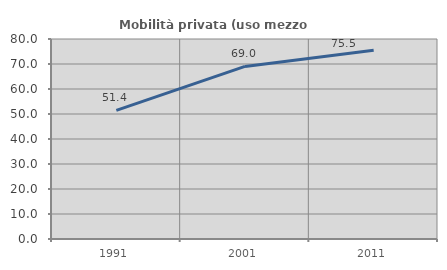
| Category | Mobilità privata (uso mezzo privato) |
|---|---|
| 1991.0 | 51.429 |
| 2001.0 | 69.037 |
| 2011.0 | 75.485 |